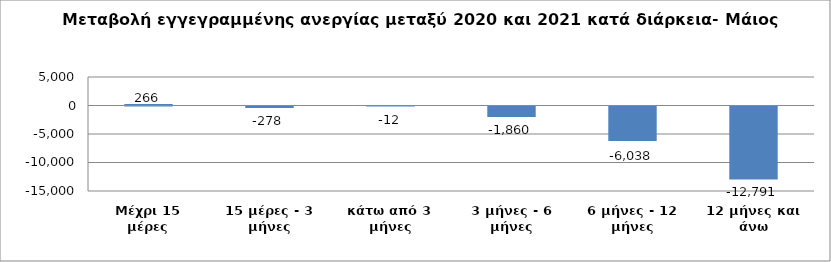
| Category | Series 0 |
|---|---|
| Μέχρι 15 μέρες | 266 |
| 15 μέρες - 3 μήνες | -278 |
| κάτω από 3 μήνες | -12 |
| 3 μήνες - 6 μήνες | -1860 |
| 6 μήνες - 12 μήνες | -6038 |
| 12 μήνες και άνω | -12791 |